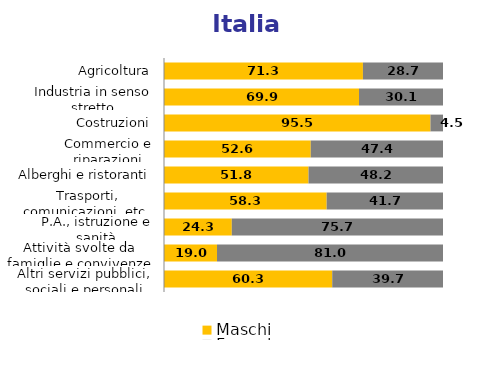
| Category | Maschi | Femmine |
|---|---|---|
| Agricoltura | 71.3 | 28.7 |
| Industria in senso stretto | 69.9 | 30.1 |
| Costruzioni | 95.5 | 4.5 |
| Commercio e riparazioni | 52.6 | 47.4 |
| Alberghi e ristoranti | 51.8 | 48.2 |
| Trasporti, comunicazioni, etc. | 58.3 | 41.7 |
| P.A., istruzione e sanità | 24.3 | 75.7 |
| Attività svolte da famiglie e convivenze | 19 | 81 |
| Altri servizi pubblici, sociali e personali | 60.3 | 39.7 |